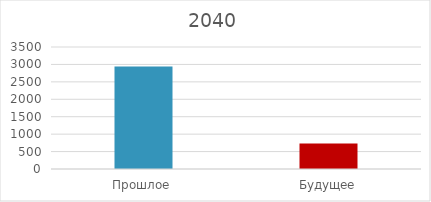
| Category | Series 0 |
|---|---|
| Прошлое | 2944 |
| Будущее | 728 |